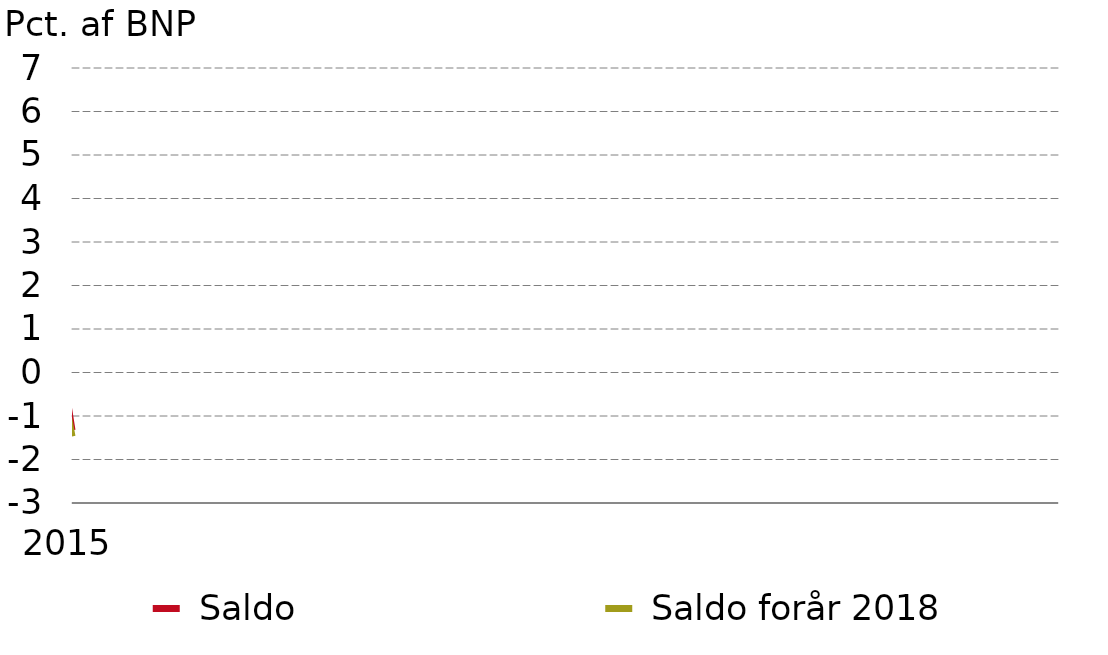
| Category | nullinje |  Saldo |  Saldo forår 2018 |
|---|---|---|---|
| 2015-01-01 | 0 | -1.33 | -1.471 |
| 2016-01-01 | 0 | -0.073 | -0.409 |
| 2017-01-01 | 0 | 1.45 | 1 |
| 2018-01-01 | 0 | 0.559 | -0.858 |
| 2019-01-01 | 0 | 2.237 | -0.482 |
| 2020-01-01 | 0 | 0.461 | -0.235 |
| 2021-01-01 | 0 | -0.245 | 0.257 |
| 2022-01-01 | 0 | -0.147 | 0.468 |
| 2023-01-01 | 0 | -0.222 | 0.284 |
| 2024-01-01 | 0 | -0.116 | 0.064 |
| 2025-01-01 | 0 | 0.066 | 0.115 |
| 2026-01-01 | 0 | 0.225 | 0.279 |
| 2027-01-01 | 0 | 0.278 | 0.221 |
| 2028-01-01 | 0 | 0.206 | 0.096 |
| 2029-01-01 | 0 | 0.143 | -0.046 |
| 2030-01-01 | 0 | 0.248 | 0.113 |
| 2031-01-01 | 0 | 0.299 | 0.053 |
| 2032-01-01 | 0 | 0.242 | -0.053 |
| 2033-01-01 | 0 | 0.161 | -0.222 |
| 2034-01-01 | 0 | 0.036 | -0.401 |
| 2035-01-01 | 0 | 0.103 | -0.412 |
| 2036-01-01 | 0 | 0.295 | -0.283 |
| 2037-01-01 | 0 | 0.296 | -0.374 |
| 2038-01-01 | 0 | 0.308 | -0.365 |
| 2039-01-01 | 0 | 0.352 | -0.435 |
| 2040-01-01 | 0 | 0.532 | -0.311 |
| 2041-01-01 | 0 | 0.757 | -0.076 |
| 2042-01-01 | 0 | 0.809 | -0.126 |
| 2043-01-01 | 0 | 0.878 | -0.094 |
| 2044-01-01 | 0 | 0.89 | -0.156 |
| 2045-01-01 | 0 | 1.038 | -0.029 |
| 2046-01-01 | 0 | 1.256 | 0.203 |
| 2047-01-01 | 0 | 1.337 | 0.23 |
| 2048-01-01 | 0 | 1.426 | 0.205 |
| 2049-01-01 | 0 | 1.506 | 0.249 |
| 2050-01-01 | 0 | 1.69 | 0.391 |
| 2051-01-01 | 0 | 1.874 | 0.642 |
| 2052-01-01 | 0 | 1.991 | 0.713 |
| 2053-01-01 | 0 | 2.136 | 0.737 |
| 2054-01-01 | 0 | 2.286 | 0.885 |
| 2055-01-01 | 0 | 2.458 | 1.029 |
| 2056-01-01 | 0 | 2.564 | 1.287 |
| 2057-01-01 | 0 | 2.721 | 1.375 |
| 2058-01-01 | 0 | 2.879 | 1.428 |
| 2059-01-01 | 0 | 3.035 | 1.567 |
| 2060-01-01 | 0 | 3.297 | 1.654 |
| 2061-01-01 | 0 | 3.607 | 1.818 |
| 2062-01-01 | 0 | 3.835 | 1.919 |
| 2063-01-01 | 0 | 3.99 | 1.964 |
| 2064-01-01 | 0 | 4.139 | 2.025 |
| 2065-01-01 | 0 | 4.407 | 2.182 |
| 2066-01-01 | 0 | 4.704 | 2.416 |
| 2067-01-01 | 0 | 4.895 | 2.54 |
| 2068-01-01 | 0 | 5.028 | 2.546 |
| 2069-01-01 | 0 | 5.177 | 2.568 |
| 2070-01-01 | 0 | 5.308 | 2.585 |
| 2071-01-01 | 0 | 5.423 | 2.774 |
| 2072-01-01 | 0 | 5.588 | 3.019 |
| 2073-01-01 | 0 | 5.701 | 3.092 |
| 2074-01-01 | 0 | 5.838 | 3.164 |
| 2075-01-01 | 0 | 6.041 | 3.229 |